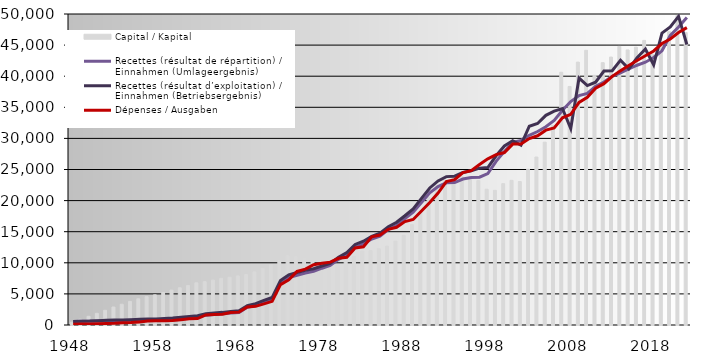
| Category | Capital / Kapital |
|---|---|
| 1948.0 | 454.944 |
| 1949.0 | 923.796 |
| 1950.0 | 1400.063 |
| 1951.0 | 1878.543 |
| 1952.0 | 2364.211 |
| 1953.0 | 2895.811 |
| 1954.0 | 3336.018 |
| 1955.0 | 3800.741 |
| 1956.0 | 4221.117 |
| 1957.0 | 4560.33 |
| 1958.0 | 4848.554 |
| 1959.0 | 5221.266 |
| 1960.0 | 5607.179 |
| 1961.0 | 5989.615 |
| 1962.0 | 6344.013 |
| 1963.0 | 6789.732 |
| 1964.0 | 6970.941 |
| 1965.0 | 7214.784 |
| 1966.0 | 7503.725 |
| 1967.0 | 7685.942 |
| 1968.0 | 7896.713 |
| 1969.0 | 8112.716 |
| 1970.0 | 8546.829 |
| 1971.0 | 9091.825 |
| 1972.0 | 9710.287 |
| 1973.0 | 10368.598 |
| 1974.0 | 11170.591 |
| 1975.0 | 11001.711 |
| 1976.0 | 10790.709 |
| 1977.0 | 10148.384 |
| 1978.0 | 9714.598 |
| 1979.0 | 9521.465 |
| 1980.0 | 9691.392 |
| 1981.0 | 10436.991 |
| 1982.0 | 10999.624 |
| 1983.0 | 11889.934 |
| 1984.0 | 11971.607 |
| 1985.0 | 12253.645 |
| 1986.0 | 12680.592 |
| 1987.0 | 13483.864 |
| 1988.0 | 14415.28 |
| 1989.0 | 16129.886 |
| 1990.0 | 18157.121 |
| 1991.0 | 20502.473 |
| 1992.0 | 22456.125 |
| 1993.0 | 23265.913 |
| 1994.0 | 23826.71 |
| 1995.0 | 23835.538 |
| 1996.0 | 23806.957 |
| 1997.0 | 23223.558 |
| 1998.0 | 21829.998 |
| 1999.0 | 21650.265 |
| 2000.0 | 22720.275 |
| 2001.0 | 23258.556 |
| 2002.0 | 23067.294 |
| 2003.0 | 25044.21 |
| 2004.0 | 27008.229 |
| 2005.0 | 29392.874 |
| 2006.0 | 32100.397 |
| 2007.0 | 40636.638 |
| 2008.0 | 38350.66 |
| 2009.0 | 42267.589 |
| 2010.0 | 44158.392 |
| 2011.0 | 40146.454 |
| 2012.0 | 42172.796 |
| 2013.0 | 43080.386 |
| 2014.0 | 44787.573 |
| 2015.0 | 44229.134 |
| 2016.0 | 44667.561 |
| 2017.0 | 45754.63 |
| 2018.0 | 43534.817 |
| 2019.0 | 45217.248 |
| 2020.0 | 47158.005 |
| 2021.0 | 49740.942 |
| 2022.0 | 47035.172 |